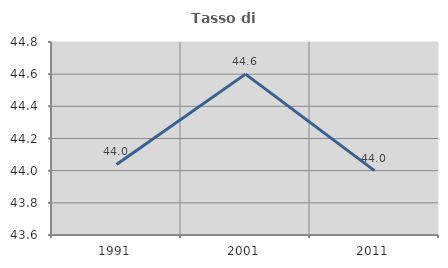
| Category | Tasso di occupazione   |
|---|---|
| 1991.0 | 44.039 |
| 2001.0 | 44.6 |
| 2011.0 | 44 |